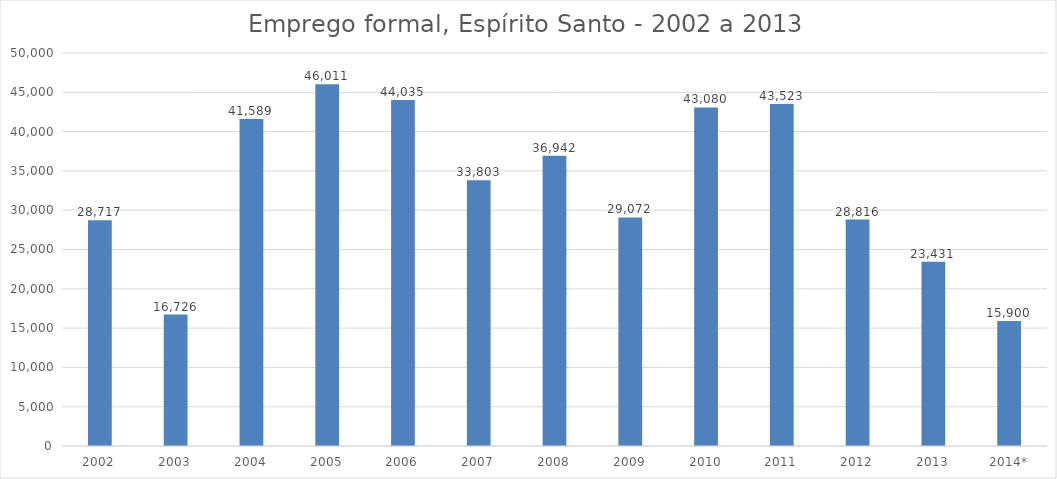
| Category | Series 1 |
|---|---|
| 2002 | 28717 |
| 2003 | 16726 |
| 2004 | 41589 |
| 2005 | 46011 |
| 2006 | 44035 |
| 2007 | 33803 |
| 2008 | 36942 |
| 2009 | 29072 |
| 2010 | 43080 |
| 2011 | 43523 |
| 2012 | 28816 |
| 2013 | 23431 |
| 2014* | 15900 |